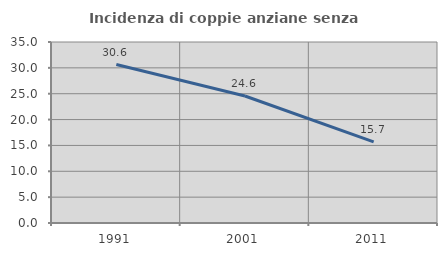
| Category | Incidenza di coppie anziane senza figli  |
|---|---|
| 1991.0 | 30.645 |
| 2001.0 | 24.561 |
| 2011.0 | 15.686 |